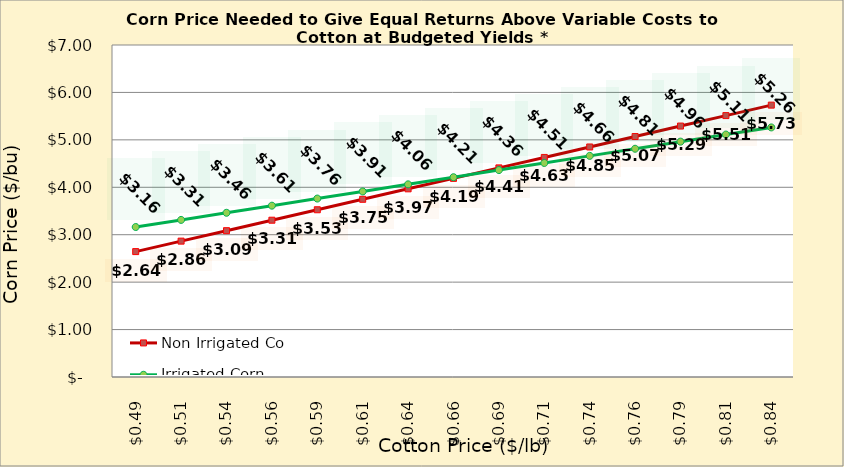
| Category | Non Irrigated Corn | Irrigated Corn |
|---|---|---|
| 0.4849999999999999 | 2.644 | 3.162 |
| 0.5099999999999999 | 2.865 | 3.312 |
| 0.5349999999999999 | 3.085 | 3.462 |
| 0.5599999999999999 | 3.306 | 3.612 |
| 0.585 | 3.526 | 3.762 |
| 0.61 | 3.747 | 3.912 |
| 0.635 | 3.967 | 4.062 |
| 0.66 | 4.188 | 4.212 |
| 0.685 | 4.409 | 4.362 |
| 0.7100000000000001 | 4.629 | 4.512 |
| 0.7350000000000001 | 4.85 | 4.662 |
| 0.7600000000000001 | 5.07 | 4.812 |
| 0.7850000000000001 | 5.291 | 4.962 |
| 0.8100000000000002 | 5.512 | 5.112 |
| 0.8350000000000002 | 5.732 | 5.262 |